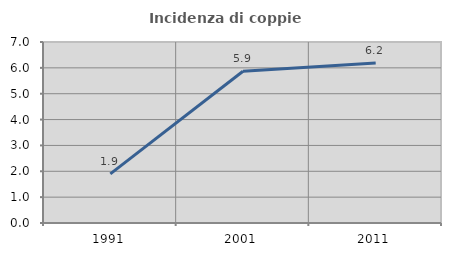
| Category | Incidenza di coppie miste |
|---|---|
| 1991.0 | 1.899 |
| 2001.0 | 5.868 |
| 2011.0 | 6.19 |